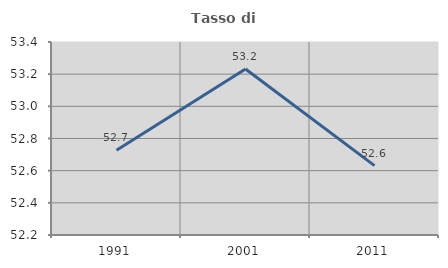
| Category | Tasso di occupazione   |
|---|---|
| 1991.0 | 52.727 |
| 2001.0 | 53.232 |
| 2011.0 | 52.632 |